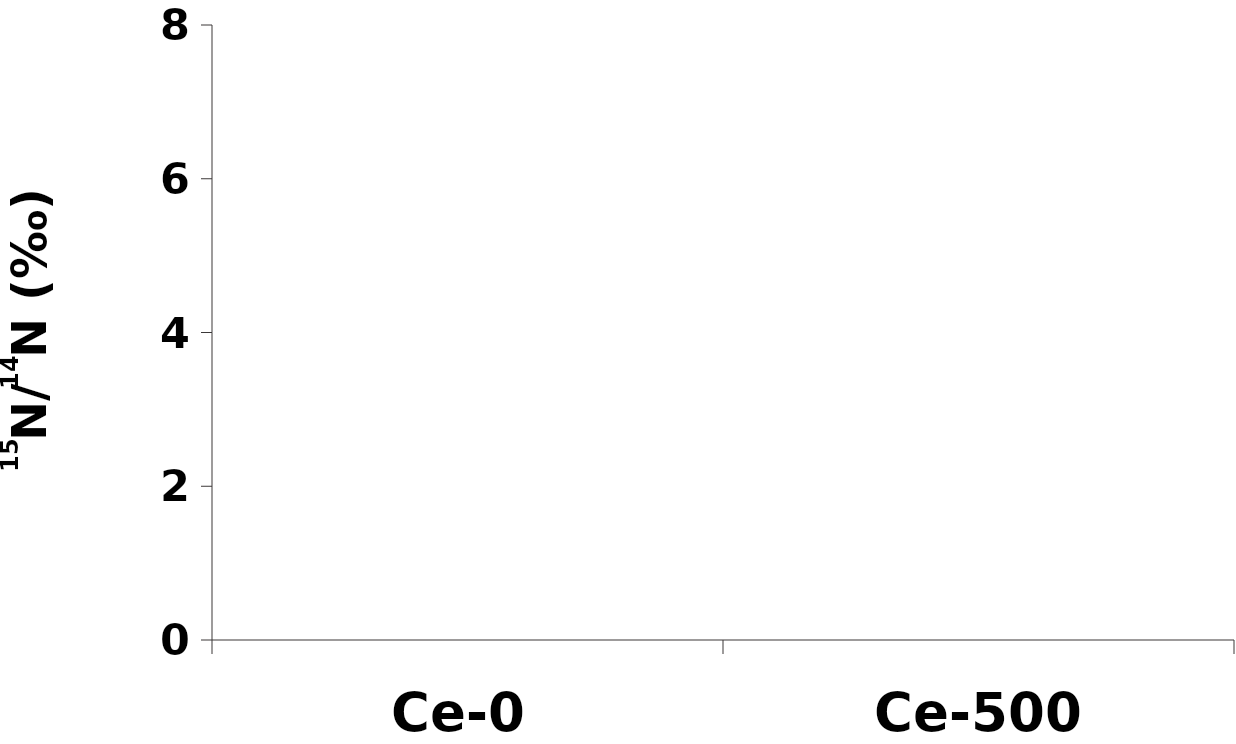
| Category | δ15N |
|---|---|
| Ce-0 | -3.05 |
| Ce-500 | -2.998 |